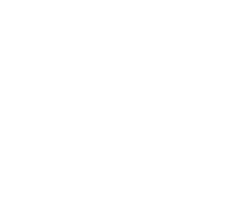
| Category | Series 0 | Series 1 | Series 2 |
|---|---|---|---|
| 0 | 0 | 0 | 0 |
| 1 | 0 | 0 | 0 |
| 2 | 0 | 0 | 0 |
| 3 | 0 | 0 | 0 |
| 4 | 0 | 0 | 0 |
| 5 | 0 | 0 | 0 |
| 6 | 0 | 0 | 0 |
| 7 | 0 | 0 | 0 |
| 8 | 0 | 0 | 0 |
| 9 | 0 | 0 | 0 |